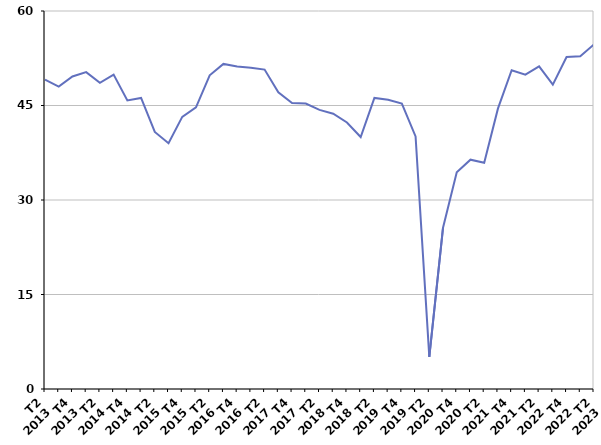
| Category | Radiation administrative |
|---|---|
| T2
2013 | 49.1 |
| T3
2013 | 48 |
| T4
2013 | 49.6 |
| T1
2014 | 50.3 |
| T2
2014 | 48.6 |
| T3
2014 | 49.9 |
| T4
2014 | 45.8 |
| T1
2015 | 46.2 |
| T2
2015 | 40.8 |
| T3
2015 | 39 |
| T4
2015 | 43.2 |
| T1
2016 | 44.7 |
| T2
2016 | 49.8 |
| T3
2016 | 51.6 |
| T4
2016 | 51.2 |
| T1
2017 | 51 |
| T2
2017 | 50.7 |
| T3
2017 | 47.1 |
| T4
2017 | 45.4 |
| T1
2018 | 45.3 |
| T2
2018 | 44.3 |
| T3
2018 | 43.7 |
| T4
2018 | 42.3 |
| T1
2019 | 40 |
| T2
2019 | 46.2 |
| T3
2019 | 45.9 |
| T4
2019 | 45.3 |
| T1
2020 | 40.1 |
| T2
2020 | 5.1 |
| T3
2020 | 25.6 |
| T4
2020 | 34.4 |
| T1
2021 | 36.4 |
| T2
2021 | 35.9 |
| T3
2021 | 44.5 |
| T4
2021 | 50.6 |
| T1
2022 | 49.9 |
| T2
2022 | 51.2 |
| T3
2022 | 48.3 |
| T4
2022 | 52.7 |
| T1
2023 | 52.8 |
| T2
2023 | 54.7 |